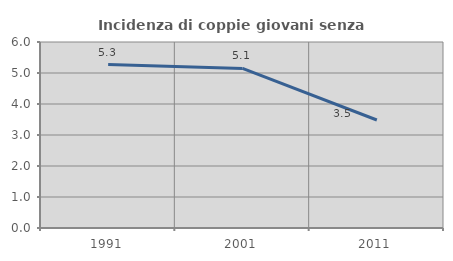
| Category | Incidenza di coppie giovani senza figli |
|---|---|
| 1991.0 | 5.273 |
| 2001.0 | 5.147 |
| 2011.0 | 3.483 |